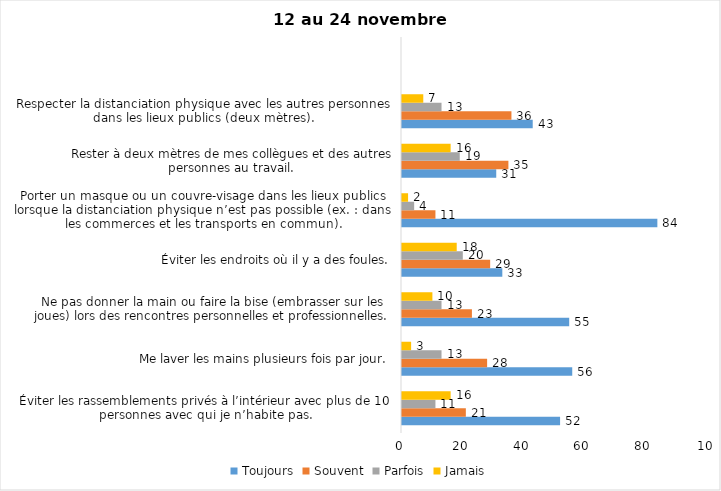
| Category | Toujours | Souvent | Parfois | Jamais |
|---|---|---|---|---|
| Éviter les rassemblements privés à l’intérieur avec plus de 10 personnes avec qui je n’habite pas. | 52 | 21 | 11 | 16 |
| Me laver les mains plusieurs fois par jour. | 56 | 28 | 13 | 3 |
| Ne pas donner la main ou faire la bise (embrasser sur les joues) lors des rencontres personnelles et professionnelles. | 55 | 23 | 13 | 10 |
| Éviter les endroits où il y a des foules. | 33 | 29 | 20 | 18 |
| Porter un masque ou un couvre-visage dans les lieux publics lorsque la distanciation physique n’est pas possible (ex. : dans les commerces et les transports en commun). | 84 | 11 | 4 | 2 |
| Rester à deux mètres de mes collègues et des autres personnes au travail. | 31 | 35 | 19 | 16 |
| Respecter la distanciation physique avec les autres personnes dans les lieux publics (deux mètres). | 43 | 36 | 13 | 7 |